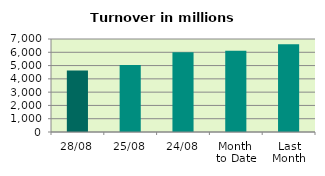
| Category | Series 0 |
|---|---|
| 28/08 | 4620.246 |
| 25/08 | 5050.964 |
| 24/08 | 5996.745 |
| Month 
to Date | 6116.378 |
| Last
Month | 6596.254 |